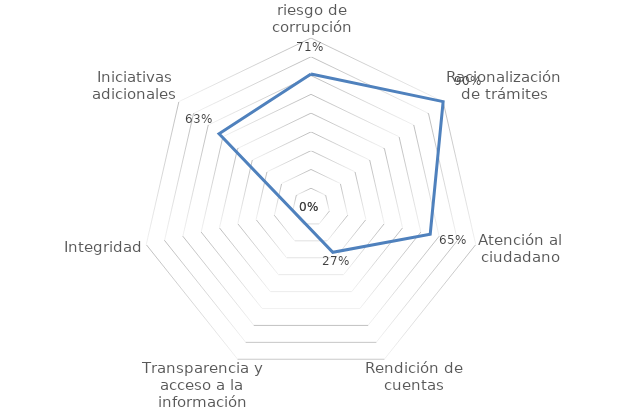
| Category | Series 0 |
|---|---|
| Gestión del riesgo de corrupción | 0.708 |
| Racionalización de trámites | 0.9 |
| Atención al ciudadano | 0.651 |
| Rendición de cuentas | 0.268 |
| Transparencia y acceso a la información | 0 |
| Integridad | 0 |
| Iniciativas adicionales | 0.626 |